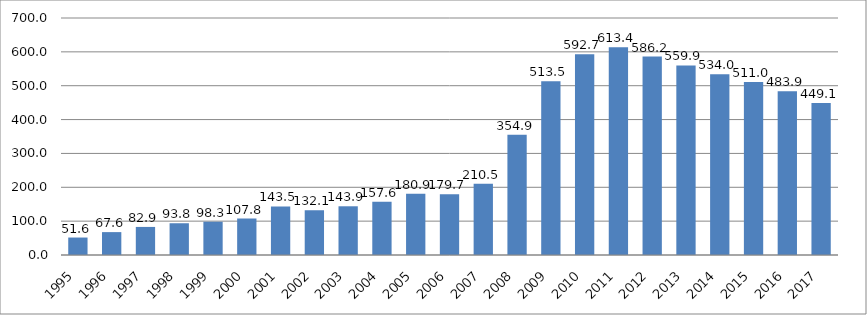
| Category | Disbursed Outstanding Debt |
|---|---|
| 1995.0 | 51.6 |
| 1996.0 | 67.6 |
| 1997.0 | 82.9 |
| 1998.0 | 93.8 |
| 1999.0 | 98.3 |
| 2000.0 | 107.8 |
| 2001.0 | 143.5 |
| 2002.0 | 132.1 |
| 2003.0 | 143.9 |
| 2004.0 | 157.6 |
| 2005.0 | 180.9 |
| 2006.0 | 179.7 |
| 2007.0 | 210.5 |
| 2008.0 | 354.9 |
| 2009.0 | 513.5 |
| 2010.0 | 592.7 |
| 2011.0 | 613.4 |
| 2012.0 | 586.2 |
| 2013.0 | 559.9 |
| 2014.0 | 534 |
| 2015.0 | 511 |
| 2016.0 | 483.868 |
| 2017.0 | 449.148 |